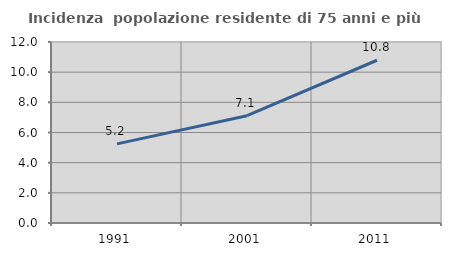
| Category | Incidenza  popolazione residente di 75 anni e più |
|---|---|
| 1991.0 | 5.245 |
| 2001.0 | 7.114 |
| 2011.0 | 10.79 |